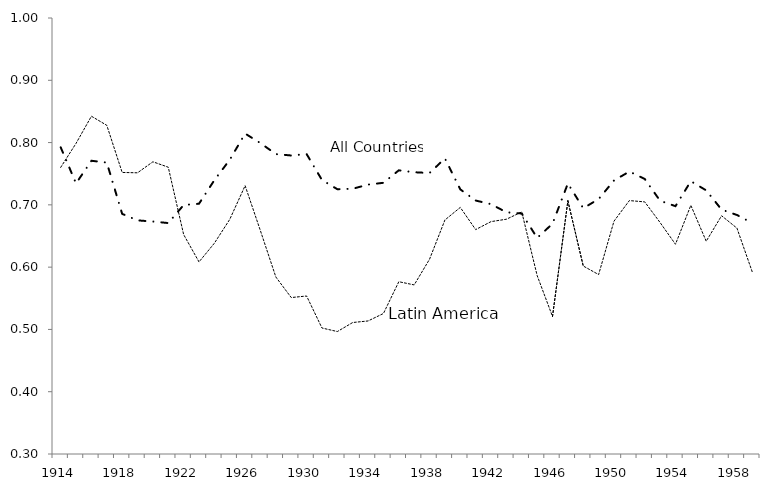
| Category | Series 0 | Series 1 |
|---|---|---|
| 1914.0 | 0.792 | 0.76 |
| 1915.0 | 0.734 | 0.799 |
| 1916.0 | 0.771 | 0.842 |
| 1917.0 | 0.768 | 0.828 |
| 1918.0 | 0.686 | 0.752 |
| 1919.0 | 0.675 | 0.751 |
| 1920.0 | 0.673 | 0.769 |
| 1921.0 | 0.671 | 0.76 |
| 1922.0 | 0.7 | 0.652 |
| 1923.0 | 0.702 | 0.608 |
| 1924.0 | 0.74 | 0.638 |
| 1925.0 | 0.772 | 0.677 |
| 1926.0 | 0.814 | 0.731 |
| 1927.0 | 0.799 | 0.658 |
| 1928.0 | 0.782 | 0.584 |
| 1929.0 | 0.779 | 0.551 |
| 1930.0 | 0.782 | 0.554 |
| 1931.0 | 0.74 | 0.502 |
| 1932.0 | 0.725 | 0.497 |
| 1933.0 | 0.726 | 0.511 |
| 1934.0 | 0.733 | 0.514 |
| 1935.0 | 0.735 | 0.526 |
| 1936.0 | 0.755 | 0.577 |
| 1937.0 | 0.752 | 0.571 |
| 1938.0 | 0.751 | 0.613 |
| 1939.0 | 0.775 | 0.676 |
| 1940.0 | 0.725 | 0.696 |
| 1941.0 | 0.707 | 0.66 |
| 1942.0 | 0.701 | 0.673 |
| 1943.0 | 0.688 | 0.677 |
| 1944.0 | 0.686 | 0.689 |
| 1945.0 | 0.647 | 0.586 |
| 1946.0 | 0.67 | 0.521 |
| 1947.0 | 0.734 | 0.706 |
| 1948.0 | 0.695 | 0.602 |
| 1949.0 | 0.709 | 0.588 |
| 1950.0 | 0.739 | 0.674 |
| 1951.0 | 0.753 | 0.707 |
| 1952.0 | 0.742 | 0.705 |
| 1953.0 | 0.707 | 0.672 |
| 1954.0 | 0.698 | 0.637 |
| 1955.0 | 0.738 | 0.699 |
| 1956.0 | 0.723 | 0.642 |
| 1957.0 | 0.692 | 0.682 |
| 1958.0 | 0.684 | 0.663 |
| 1959.0 | 0.671 | 0.592 |